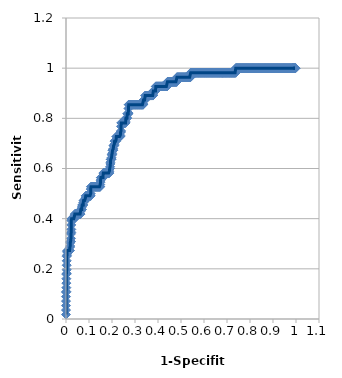
| Category | 1-Specifity |
|---|---|
| 0.0 | 0.018 |
| 0.0 | 0.036 |
| 0.0 | 0.054 |
| 0.0 | 0.071 |
| 0.0 | 0.089 |
| 0.0 | 0.107 |
| 0.00153139356814702 | 0.109 |
| 0.00153374233128833 | 0.125 |
| 0.00153374233128833 | 0.143 |
| 0.00153374233128833 | 0.161 |
| 0.00153374233128833 | 0.179 |
| 0.00306278713629404 | 0.182 |
| 0.00306748466257667 | 0.196 |
| 0.00306748466257667 | 0.214 |
| 0.00306748466257667 | 0.232 |
| 0.00306748466257667 | 0.25 |
| 0.00459418070444106 | 0.255 |
| 0.004601226993865 | 0.268 |
| 0.00612557427258809 | 0.273 |
| 0.00765696784073511 | 0.273 |
| 0.00918836140888213 | 0.273 |
| 0.0107197549770292 | 0.273 |
| 0.0122511485451761 | 0.273 |
| 0.0137825421133231 | 0.273 |
| 0.0153139356814701 | 0.273 |
| 0.0168453292496171 | 0.273 |
| 0.0168711656441718 | 0.286 |
| 0.0183767228177641 | 0.291 |
| 0.0184049079754601 | 0.304 |
| 0.0199081163859112 | 0.309 |
| 0.0214395099540582 | 0.309 |
| 0.0214723926380368 | 0.321 |
| 0.0214723926380368 | 0.339 |
| 0.0229709035222052 | 0.345 |
| 0.0230061349693251 | 0.357 |
| 0.0230061349693251 | 0.375 |
| 0.0230061349693251 | 0.393 |
| 0.0245022970903522 | 0.4 |
| 0.0260336906584993 | 0.4 |
| 0.0275650842266463 | 0.4 |
| 0.0290964777947933 | 0.4 |
| 0.0306278713629403 | 0.4 |
| 0.0321592649310873 | 0.4 |
| 0.0336906584992342 | 0.4 |
| 0.0352220520673813 | 0.4 |
| 0.0367534456355283 | 0.4 |
| 0.0368098159509203 | 0.411 |
| 0.0382848392036753 | 0.418 |
| 0.0398162327718223 | 0.418 |
| 0.0413476263399694 | 0.418 |
| 0.0428790199081164 | 0.418 |
| 0.0444104134762634 | 0.418 |
| 0.0459418070444104 | 0.418 |
| 0.0474732006125574 | 0.418 |
| 0.0490045941807045 | 0.418 |
| 0.0505359877488515 | 0.418 |
| 0.0520673813169985 | 0.418 |
| 0.0535987748851455 | 0.418 |
| 0.0551301684532926 | 0.418 |
| 0.0566615620214395 | 0.418 |
| 0.0581929555895865 | 0.418 |
| 0.0597243491577335 | 0.418 |
| 0.0612557427258805 | 0.418 |
| 0.0627871362940275 | 0.418 |
| 0.0628834355828221 | 0.429 |
| 0.0643185298621746 | 0.436 |
| 0.0658499234303216 | 0.436 |
| 0.0673813169984686 | 0.436 |
| 0.0689127105666156 | 0.436 |
| 0.0690184049079755 | 0.446 |
| 0.0704441041347627 | 0.455 |
| 0.0719754977029097 | 0.455 |
| 0.0735068912710567 | 0.455 |
| 0.0750382848392037 | 0.455 |
| 0.0751533742331288 | 0.464 |
| 0.0765696784073507 | 0.473 |
| 0.0781010719754976 | 0.473 |
| 0.0796324655436447 | 0.473 |
| 0.0811638591117917 | 0.473 |
| 0.0826952526799387 | 0.473 |
| 0.0842266462480857 | 0.473 |
| 0.0843558282208589 | 0.482 |
| 0.0857580398162328 | 0.491 |
| 0.0872894333843798 | 0.491 |
| 0.0888208269525268 | 0.491 |
| 0.0903522205206738 | 0.491 |
| 0.0918836140888208 | 0.491 |
| 0.0934150076569679 | 0.491 |
| 0.0949464012251149 | 0.491 |
| 0.0964777947932619 | 0.491 |
| 0.0980091883614089 | 0.491 |
| 0.0995405819295559 | 0.491 |
| 0.101071975497703 | 0.491 |
| 0.10260336906585 | 0.491 |
| 0.104134762633997 | 0.491 |
| 0.105666156202144 | 0.491 |
| 0.107197549770291 | 0.491 |
| 0.107361963190184 | 0.5 |
| 0.107361963190184 | 0.518 |
| 0.108728943338438 | 0.527 |
| 0.110260336906585 | 0.527 |
| 0.111791730474732 | 0.527 |
| 0.113323124042879 | 0.527 |
| 0.114854517611026 | 0.527 |
| 0.116385911179173 | 0.527 |
| 0.11791730474732 | 0.527 |
| 0.119448698315467 | 0.527 |
| 0.120980091883614 | 0.527 |
| 0.122511485451761 | 0.527 |
| 0.124042879019908 | 0.527 |
| 0.125574272588055 | 0.527 |
| 0.127105666156202 | 0.527 |
| 0.128637059724349 | 0.527 |
| 0.130168453292496 | 0.527 |
| 0.131699846860643 | 0.527 |
| 0.13323124042879 | 0.527 |
| 0.134762633996937 | 0.527 |
| 0.136294027565084 | 0.527 |
| 0.137825421133231 | 0.527 |
| 0.139356814701378 | 0.527 |
| 0.140888208269525 | 0.527 |
| 0.142419601837672 | 0.527 |
| 0.143950995405819 | 0.527 |
| 0.145482388973966 | 0.527 |
| 0.147013782542113 | 0.527 |
| 0.14854517611026 | 0.527 |
| 0.148773006134969 | 0.536 |
| 0.150076569678407 | 0.545 |
| 0.150306748466258 | 0.554 |
| 0.151607963246554 | 0.564 |
| 0.153139356814701 | 0.564 |
| 0.154670750382848 | 0.564 |
| 0.156202143950995 | 0.564 |
| 0.157733537519142 | 0.564 |
| 0.159264931087289 | 0.564 |
| 0.160796324655436 | 0.564 |
| 0.161042944785276 | 0.571 |
| 0.162327718223584 | 0.582 |
| 0.163859111791731 | 0.582 |
| 0.165390505359878 | 0.582 |
| 0.166921898928024 | 0.582 |
| 0.168453292496171 | 0.582 |
| 0.169984686064319 | 0.582 |
| 0.171516079632466 | 0.582 |
| 0.173047473200613 | 0.582 |
| 0.17457886676876 | 0.582 |
| 0.176110260336907 | 0.582 |
| 0.177641653905054 | 0.582 |
| 0.179173047473201 | 0.582 |
| 0.180704441041348 | 0.582 |
| 0.182235834609495 | 0.582 |
| 0.183767228177642 | 0.582 |
| 0.185298621745789 | 0.582 |
| 0.186830015313936 | 0.582 |
| 0.188361408882083 | 0.582 |
| 0.188650306748466 | 0.589 |
| 0.18989280245023 | 0.6 |
| 0.191424196018377 | 0.6 |
| 0.191717791411043 | 0.607 |
| 0.192955589586524 | 0.618 |
| 0.193251533742331 | 0.625 |
| 0.194486983154671 | 0.636 |
| 0.196018376722818 | 0.636 |
| 0.197549770290965 | 0.636 |
| 0.197852760736196 | 0.643 |
| 0.199081163859112 | 0.655 |
| 0.200612557427259 | 0.655 |
| 0.200920245398773 | 0.661 |
| 0.202143950995406 | 0.673 |
| 0.203675344563553 | 0.673 |
| 0.2052067381317 | 0.673 |
| 0.205521472392638 | 0.679 |
| 0.206738131699847 | 0.691 |
| 0.208269525267994 | 0.691 |
| 0.209800918836141 | 0.691 |
| 0.210122699386503 | 0.696 |
| 0.211332312404288 | 0.709 |
| 0.212863705972435 | 0.709 |
| 0.214395099540582 | 0.709 |
| 0.215926493108729 | 0.709 |
| 0.217457886676876 | 0.709 |
| 0.217791411042945 | 0.714 |
| 0.218989280245023 | 0.727 |
| 0.22052067381317 | 0.727 |
| 0.222052067381317 | 0.727 |
| 0.223583460949464 | 0.727 |
| 0.225114854517611 | 0.727 |
| 0.226646248085758 | 0.727 |
| 0.228177641653905 | 0.727 |
| 0.229709035222052 | 0.727 |
| 0.231240428790199 | 0.727 |
| 0.232771822358346 | 0.727 |
| 0.234303215926493 | 0.727 |
| 0.23583460949464 | 0.727 |
| 0.236196319018405 | 0.732 |
| 0.237366003062787 | 0.745 |
| 0.238897396630934 | 0.745 |
| 0.239263803680982 | 0.75 |
| 0.239263803680982 | 0.768 |
| 0.240428790199081 | 0.782 |
| 0.241960183767228 | 0.782 |
| 0.243491577335375 | 0.782 |
| 0.245022970903522 | 0.782 |
| 0.246554364471669 | 0.782 |
| 0.248085758039816 | 0.782 |
| 0.249617151607963 | 0.782 |
| 0.25114854517611 | 0.782 |
| 0.252679938744257 | 0.782 |
| 0.254211332312404 | 0.782 |
| 0.255742725880551 | 0.782 |
| 0.257274119448698 | 0.782 |
| 0.258805513016845 | 0.782 |
| 0.25920245398773 | 0.786 |
| 0.260336906584992 | 0.8 |
| 0.261868300153139 | 0.8 |
| 0.263399693721286 | 0.8 |
| 0.264931087289433 | 0.8 |
| 0.265337423312883 | 0.804 |
| 0.26646248085758 | 0.818 |
| 0.267993874425727 | 0.818 |
| 0.269525267993874 | 0.818 |
| 0.271056661562021 | 0.818 |
| 0.271472392638037 | 0.821 |
| 0.271472392638037 | 0.839 |
| 0.272588055130168 | 0.855 |
| 0.274119448698315 | 0.855 |
| 0.275650842266463 | 0.855 |
| 0.27718223583461 | 0.855 |
| 0.278713629402756 | 0.855 |
| 0.280245022970903 | 0.855 |
| 0.28177641653905 | 0.855 |
| 0.283307810107198 | 0.855 |
| 0.284839203675345 | 0.855 |
| 0.286370597243492 | 0.855 |
| 0.287901990811639 | 0.855 |
| 0.289433384379786 | 0.855 |
| 0.290964777947933 | 0.855 |
| 0.29249617151608 | 0.855 |
| 0.294027565084227 | 0.855 |
| 0.295558958652374 | 0.855 |
| 0.297090352220521 | 0.855 |
| 0.298621745788668 | 0.855 |
| 0.300153139356815 | 0.855 |
| 0.301684532924962 | 0.855 |
| 0.303215926493109 | 0.855 |
| 0.304747320061256 | 0.855 |
| 0.306278713629403 | 0.855 |
| 0.30781010719755 | 0.855 |
| 0.309341500765697 | 0.855 |
| 0.310872894333844 | 0.855 |
| 0.312404287901991 | 0.855 |
| 0.313935681470138 | 0.855 |
| 0.315467075038285 | 0.855 |
| 0.316998468606432 | 0.855 |
| 0.318529862174579 | 0.855 |
| 0.320061255742726 | 0.855 |
| 0.321592649310873 | 0.855 |
| 0.32312404287902 | 0.855 |
| 0.324655436447167 | 0.855 |
| 0.326186830015314 | 0.855 |
| 0.327718223583461 | 0.855 |
| 0.329249617151608 | 0.855 |
| 0.330781010719755 | 0.855 |
| 0.332312404287902 | 0.855 |
| 0.333843797856049 | 0.855 |
| 0.335375191424196 | 0.855 |
| 0.335889570552147 | 0.857 |
| 0.336906584992343 | 0.873 |
| 0.33843797856049 | 0.873 |
| 0.339969372128637 | 0.873 |
| 0.341500765696784 | 0.873 |
| 0.343032159264931 | 0.873 |
| 0.343558282208589 | 0.875 |
| 0.344563552833078 | 0.891 |
| 0.346094946401225 | 0.891 |
| 0.347626339969372 | 0.891 |
| 0.349157733537519 | 0.891 |
| 0.350689127105666 | 0.891 |
| 0.352220520673813 | 0.891 |
| 0.35375191424196 | 0.891 |
| 0.355283307810107 | 0.891 |
| 0.356814701378254 | 0.891 |
| 0.358346094946401 | 0.891 |
| 0.359877488514548 | 0.891 |
| 0.361408882082695 | 0.891 |
| 0.362940275650842 | 0.891 |
| 0.364471669218989 | 0.891 |
| 0.366003062787136 | 0.891 |
| 0.367534456355283 | 0.891 |
| 0.36906584992343 | 0.891 |
| 0.370597243491577 | 0.891 |
| 0.372128637059724 | 0.891 |
| 0.373660030627871 | 0.891 |
| 0.375191424196018 | 0.891 |
| 0.376722817764165 | 0.891 |
| 0.378254211332312 | 0.891 |
| 0.378834355828221 | 0.893 |
| 0.379785604900459 | 0.909 |
| 0.381316998468606 | 0.909 |
| 0.382848392036753 | 0.909 |
| 0.3843797856049 | 0.909 |
| 0.385911179173047 | 0.909 |
| 0.387442572741195 | 0.909 |
| 0.388973966309341 | 0.909 |
| 0.389570552147239 | 0.911 |
| 0.390505359877488 | 0.927 |
| 0.392036753445635 | 0.927 |
| 0.393568147013782 | 0.927 |
| 0.39509954058193 | 0.927 |
| 0.396630934150077 | 0.927 |
| 0.398162327718224 | 0.927 |
| 0.399693721286371 | 0.927 |
| 0.401225114854518 | 0.927 |
| 0.402756508422665 | 0.927 |
| 0.404287901990812 | 0.927 |
| 0.405819295558959 | 0.927 |
| 0.407350689127106 | 0.927 |
| 0.408882082695253 | 0.927 |
| 0.4104134762634 | 0.927 |
| 0.411944869831547 | 0.927 |
| 0.413476263399694 | 0.927 |
| 0.415007656967841 | 0.927 |
| 0.416539050535988 | 0.927 |
| 0.418070444104135 | 0.927 |
| 0.419601837672282 | 0.927 |
| 0.421133231240429 | 0.927 |
| 0.422664624808576 | 0.927 |
| 0.424196018376723 | 0.927 |
| 0.42572741194487 | 0.927 |
| 0.427258805513017 | 0.927 |
| 0.428790199081164 | 0.927 |
| 0.430321592649311 | 0.927 |
| 0.431852986217458 | 0.927 |
| 0.433384379785605 | 0.927 |
| 0.434915773353752 | 0.927 |
| 0.436447166921899 | 0.927 |
| 0.437978560490046 | 0.927 |
| 0.439509954058193 | 0.927 |
| 0.440184049079755 | 0.929 |
| 0.44104134762634 | 0.945 |
| 0.442572741194487 | 0.945 |
| 0.444104134762634 | 0.945 |
| 0.445635528330781 | 0.945 |
| 0.447166921898928 | 0.945 |
| 0.448698315467075 | 0.945 |
| 0.450229709035222 | 0.945 |
| 0.451761102603369 | 0.945 |
| 0.453292496171516 | 0.945 |
| 0.454823889739663 | 0.945 |
| 0.45635528330781 | 0.945 |
| 0.457886676875957 | 0.945 |
| 0.459418070444104 | 0.945 |
| 0.460949464012251 | 0.945 |
| 0.462480857580398 | 0.945 |
| 0.464012251148545 | 0.945 |
| 0.465543644716692 | 0.945 |
| 0.467075038284839 | 0.945 |
| 0.468606431852986 | 0.945 |
| 0.470137825421133 | 0.945 |
| 0.47166921898928 | 0.945 |
| 0.473200612557427 | 0.945 |
| 0.474732006125574 | 0.945 |
| 0.476263399693721 | 0.945 |
| 0.477794793261868 | 0.945 |
| 0.479326186830015 | 0.945 |
| 0.480857580398162 | 0.945 |
| 0.48159509202454 | 0.946 |
| 0.482388973966309 | 0.964 |
| 0.483920367534456 | 0.964 |
| 0.485451761102603 | 0.964 |
| 0.48698315467075 | 0.964 |
| 0.488514548238897 | 0.964 |
| 0.490045941807044 | 0.964 |
| 0.491577335375191 | 0.964 |
| 0.493108728943338 | 0.964 |
| 0.494640122511485 | 0.964 |
| 0.496171516079632 | 0.964 |
| 0.497702909647779 | 0.964 |
| 0.499234303215927 | 0.964 |
| 0.500765696784073 | 0.964 |
| 0.502297090352221 | 0.964 |
| 0.503828483920367 | 0.964 |
| 0.505359877488515 | 0.964 |
| 0.506891271056662 | 0.964 |
| 0.508422664624809 | 0.964 |
| 0.509954058192956 | 0.964 |
| 0.511485451761103 | 0.964 |
| 0.51301684532925 | 0.964 |
| 0.514548238897397 | 0.964 |
| 0.516079632465544 | 0.964 |
| 0.517611026033691 | 0.964 |
| 0.519142419601838 | 0.964 |
| 0.520673813169985 | 0.964 |
| 0.522205206738132 | 0.964 |
| 0.523736600306279 | 0.964 |
| 0.525267993874426 | 0.964 |
| 0.526799387442573 | 0.964 |
| 0.52833078101072 | 0.964 |
| 0.529862174578867 | 0.964 |
| 0.531393568147014 | 0.964 |
| 0.532924961715161 | 0.964 |
| 0.534456355283308 | 0.964 |
| 0.535987748851455 | 0.964 |
| 0.537519142419602 | 0.964 |
| 0.539050535987749 | 0.964 |
| 0.540581929555896 | 0.964 |
| 0.541411042944785 | 0.964 |
| 0.542113323124043 | 0.982 |
| 0.54364471669219 | 0.982 |
| 0.545176110260337 | 0.982 |
| 0.546707503828484 | 0.982 |
| 0.548238897396631 | 0.982 |
| 0.549770290964778 | 0.982 |
| 0.551301684532925 | 0.982 |
| 0.552833078101072 | 0.982 |
| 0.554364471669219 | 0.982 |
| 0.555895865237366 | 0.982 |
| 0.557427258805513 | 0.982 |
| 0.55895865237366 | 0.982 |
| 0.560490045941807 | 0.982 |
| 0.562021439509954 | 0.982 |
| 0.563552833078101 | 0.982 |
| 0.565084226646248 | 0.982 |
| 0.566615620214395 | 0.982 |
| 0.568147013782542 | 0.982 |
| 0.569678407350689 | 0.982 |
| 0.571209800918836 | 0.982 |
| 0.572741194486983 | 0.982 |
| 0.57427258805513 | 0.982 |
| 0.575803981623277 | 0.982 |
| 0.577335375191424 | 0.982 |
| 0.578866768759571 | 0.982 |
| 0.580398162327718 | 0.982 |
| 0.581929555895865 | 0.982 |
| 0.583460949464012 | 0.982 |
| 0.584992343032159 | 0.982 |
| 0.586523736600306 | 0.982 |
| 0.588055130168453 | 0.982 |
| 0.5895865237366 | 0.982 |
| 0.591117917304747 | 0.982 |
| 0.592649310872894 | 0.982 |
| 0.594180704441041 | 0.982 |
| 0.595712098009188 | 0.982 |
| 0.597243491577335 | 0.982 |
| 0.598774885145482 | 0.982 |
| 0.600306278713629 | 0.982 |
| 0.601837672281776 | 0.982 |
| 0.603369065849923 | 0.982 |
| 0.604900459418071 | 0.982 |
| 0.606431852986217 | 0.982 |
| 0.607963246554364 | 0.982 |
| 0.609494640122511 | 0.982 |
| 0.611026033690659 | 0.982 |
| 0.612557427258805 | 0.982 |
| 0.614088820826953 | 0.982 |
| 0.615620214395099 | 0.982 |
| 0.617151607963246 | 0.982 |
| 0.618683001531394 | 0.982 |
| 0.620214395099541 | 0.982 |
| 0.621745788667688 | 0.982 |
| 0.623277182235835 | 0.982 |
| 0.624808575803982 | 0.982 |
| 0.626339969372129 | 0.982 |
| 0.627871362940276 | 0.982 |
| 0.629402756508423 | 0.982 |
| 0.63093415007657 | 0.982 |
| 0.632465543644717 | 0.982 |
| 0.633996937212864 | 0.982 |
| 0.635528330781011 | 0.982 |
| 0.637059724349158 | 0.982 |
| 0.638591117917305 | 0.982 |
| 0.640122511485452 | 0.982 |
| 0.641653905053599 | 0.982 |
| 0.643185298621746 | 0.982 |
| 0.644716692189893 | 0.982 |
| 0.64624808575804 | 0.982 |
| 0.647779479326187 | 0.982 |
| 0.649310872894334 | 0.982 |
| 0.650842266462481 | 0.982 |
| 0.652373660030628 | 0.982 |
| 0.653905053598775 | 0.982 |
| 0.655436447166922 | 0.982 |
| 0.656967840735069 | 0.982 |
| 0.658499234303216 | 0.982 |
| 0.660030627871363 | 0.982 |
| 0.66156202143951 | 0.982 |
| 0.663093415007657 | 0.982 |
| 0.664624808575804 | 0.982 |
| 0.666156202143951 | 0.982 |
| 0.667687595712098 | 0.982 |
| 0.669218989280245 | 0.982 |
| 0.670750382848392 | 0.982 |
| 0.672281776416539 | 0.982 |
| 0.673813169984686 | 0.982 |
| 0.675344563552833 | 0.982 |
| 0.67687595712098 | 0.982 |
| 0.678407350689127 | 0.982 |
| 0.679447852760736 | 0.982 |
| 0.679938744257274 | 0.982 |
| 0.681470137825421 | 0.982 |
| 0.683001531393568 | 0.982 |
| 0.684532924961715 | 0.982 |
| 0.686064318529862 | 0.982 |
| 0.687595712098009 | 0.982 |
| 0.689127105666156 | 0.982 |
| 0.690658499234303 | 0.982 |
| 0.69218989280245 | 0.982 |
| 0.693721286370597 | 0.982 |
| 0.695252679938744 | 0.982 |
| 0.696784073506891 | 0.982 |
| 0.698315467075038 | 0.982 |
| 0.699846860643185 | 0.982 |
| 0.701378254211332 | 0.982 |
| 0.702909647779479 | 0.982 |
| 0.704441041347626 | 0.982 |
| 0.705972434915773 | 0.982 |
| 0.70750382848392 | 0.982 |
| 0.709035222052067 | 0.982 |
| 0.710566615620214 | 0.982 |
| 0.712098009188361 | 0.982 |
| 0.713629402756508 | 0.982 |
| 0.715160796324655 | 0.982 |
| 0.716692189892803 | 0.982 |
| 0.718223583460949 | 0.982 |
| 0.719754977029097 | 0.982 |
| 0.721286370597243 | 0.982 |
| 0.722817764165391 | 0.982 |
| 0.724349157733538 | 0.982 |
| 0.725880551301685 | 0.982 |
| 0.727411944869832 | 0.982 |
| 0.728943338437979 | 0.982 |
| 0.730474732006126 | 0.982 |
| 0.732006125574273 | 0.982 |
| 0.73353751914242 | 0.982 |
| 0.735068912710567 | 0.982 |
| 0.736600306278714 | 0.982 |
| 0.737730061349693 | 0.982 |
| 0.738131699846861 | 1 |
| 0.739663093415008 | 1 |
| 0.741194486983155 | 1 |
| 0.742725880551302 | 1 |
| 0.744257274119449 | 1 |
| 0.745788667687596 | 1 |
| 0.747320061255743 | 1 |
| 0.74885145482389 | 1 |
| 0.750382848392037 | 1 |
| 0.751914241960184 | 1 |
| 0.753445635528331 | 1 |
| 0.754977029096478 | 1 |
| 0.756508422664625 | 1 |
| 0.758039816232772 | 1 |
| 0.759571209800919 | 1 |
| 0.761102603369066 | 1 |
| 0.762633996937213 | 1 |
| 0.76416539050536 | 1 |
| 0.765696784073507 | 1 |
| 0.767228177641654 | 1 |
| 0.768759571209801 | 1 |
| 0.770290964777948 | 1 |
| 0.771822358346095 | 1 |
| 0.773353751914242 | 1 |
| 0.774885145482389 | 1 |
| 0.776416539050536 | 1 |
| 0.777947932618683 | 1 |
| 0.77947932618683 | 1 |
| 0.781010719754977 | 1 |
| 0.782542113323124 | 1 |
| 0.784073506891271 | 1 |
| 0.785604900459418 | 1 |
| 0.787136294027565 | 1 |
| 0.788667687595712 | 1 |
| 0.790199081163859 | 1 |
| 0.791730474732006 | 1 |
| 0.793261868300153 | 1 |
| 0.7947932618683 | 1 |
| 0.796324655436447 | 1 |
| 0.797856049004594 | 1 |
| 0.799387442572741 | 1 |
| 0.800918836140888 | 1 |
| 0.802450229709035 | 1 |
| 0.803981623277182 | 1 |
| 0.805513016845329 | 1 |
| 0.807044410413476 | 1 |
| 0.808575803981623 | 1 |
| 0.81010719754977 | 1 |
| 0.811638591117917 | 1 |
| 0.813169984686064 | 1 |
| 0.814701378254211 | 1 |
| 0.816232771822358 | 1 |
| 0.817764165390505 | 1 |
| 0.819295558958652 | 1 |
| 0.820826952526799 | 1 |
| 0.822358346094946 | 1 |
| 0.823889739663093 | 1 |
| 0.82542113323124 | 1 |
| 0.826952526799387 | 1 |
| 0.828483920367535 | 1 |
| 0.830015313935681 | 1 |
| 0.831546707503829 | 1 |
| 0.833078101071975 | 1 |
| 0.834609494640123 | 1 |
| 0.836140888208269 | 1 |
| 0.837672281776417 | 1 |
| 0.839203675344563 | 1 |
| 0.840735068912711 | 1 |
| 0.842266462480858 | 1 |
| 0.843797856049005 | 1 |
| 0.845329249617152 | 1 |
| 0.846860643185299 | 1 |
| 0.848392036753446 | 1 |
| 0.849923430321593 | 1 |
| 0.85145482388974 | 1 |
| 0.852986217457887 | 1 |
| 0.854517611026034 | 1 |
| 0.856049004594181 | 1 |
| 0.857580398162328 | 1 |
| 0.859111791730475 | 1 |
| 0.860643185298622 | 1 |
| 0.862174578866769 | 1 |
| 0.863705972434916 | 1 |
| 0.865237366003063 | 1 |
| 0.86676875957121 | 1 |
| 0.868300153139357 | 1 |
| 0.869831546707504 | 1 |
| 0.871362940275651 | 1 |
| 0.872894333843798 | 1 |
| 0.874425727411945 | 1 |
| 0.875957120980092 | 1 |
| 0.877488514548239 | 1 |
| 0.879019908116386 | 1 |
| 0.880551301684533 | 1 |
| 0.88208269525268 | 1 |
| 0.883614088820827 | 1 |
| 0.885145482388974 | 1 |
| 0.886676875957121 | 1 |
| 0.888208269525268 | 1 |
| 0.889739663093415 | 1 |
| 0.891271056661562 | 1 |
| 0.892802450229709 | 1 |
| 0.894333843797856 | 1 |
| 0.895865237366003 | 1 |
| 0.89739663093415 | 1 |
| 0.898928024502297 | 1 |
| 0.900459418070444 | 1 |
| 0.901990811638591 | 1 |
| 0.903522205206738 | 1 |
| 0.905053598774885 | 1 |
| 0.906584992343032 | 1 |
| 0.908116385911179 | 1 |
| 0.909647779479326 | 1 |
| 0.911179173047473 | 1 |
| 0.91271056661562 | 1 |
| 0.914241960183767 | 1 |
| 0.915773353751914 | 1 |
| 0.917304747320061 | 1 |
| 0.918836140888208 | 1 |
| 0.920367534456355 | 1 |
| 0.921898928024502 | 1 |
| 0.923430321592649 | 1 |
| 0.924961715160796 | 1 |
| 0.926493108728943 | 1 |
| 0.92802450229709 | 1 |
| 0.929555895865237 | 1 |
| 0.931087289433384 | 1 |
| 0.932618683001531 | 1 |
| 0.934150076569678 | 1 |
| 0.935681470137825 | 1 |
| 0.937212863705972 | 1 |
| 0.93874425727412 | 1 |
| 0.940275650842266 | 1 |
| 0.941807044410414 | 1 |
| 0.94333843797856 | 1 |
| 0.944869831546707 | 1 |
| 0.946401225114854 | 1 |
| 0.947932618683002 | 1 |
| 0.949464012251148 | 1 |
| 0.950995405819296 | 1 |
| 0.952526799387443 | 1 |
| 0.95405819295559 | 1 |
| 0.955589586523737 | 1 |
| 0.957120980091884 | 1 |
| 0.958652373660031 | 1 |
| 0.960183767228178 | 1 |
| 0.961715160796325 | 1 |
| 0.963246554364472 | 1 |
| 0.964777947932619 | 1 |
| 0.966309341500766 | 1 |
| 0.967840735068913 | 1 |
| 0.96937212863706 | 1 |
| 0.970903522205207 | 1 |
| 0.972434915773354 | 1 |
| 0.973966309341501 | 1 |
| 0.975497702909648 | 1 |
| 0.977029096477795 | 1 |
| 0.978560490045942 | 1 |
| 0.980091883614089 | 1 |
| 0.981623277182236 | 1 |
| 0.983154670750383 | 1 |
| 0.98468606431853 | 1 |
| 0.986217457886677 | 1 |
| 0.987748851454824 | 1 |
| 0.989280245022971 | 1 |
| 0.990811638591118 | 1 |
| 0.992343032159265 | 1 |
| 0.993874425727412 | 1 |
| 0.995405819295559 | 1 |
| 0.996937212863706 | 1 |
| 0.998468606431853 | 1 |
| 0.996946564885496 | 1 |
| 0.995433789954338 | 1 |
| 0.993930197268589 | 1 |
| 0.992435703479576 | 1 |
| 0.990950226244344 | 1 |
| 0.989473684210526 | 1 |
| 0.988005997001499 | 1 |
| 0.986547085201794 | 1 |
| 0.985096870342772 | 1 |